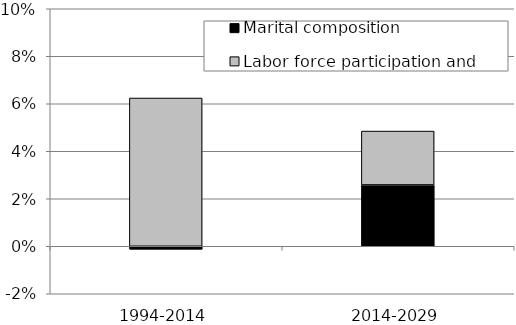
| Category | Marital composition | Labor force participation and education |
|---|---|---|
| 1994-2014 | -0.001 | 0.062 |
| 2014-2029 | 0.026 | 0.023 |